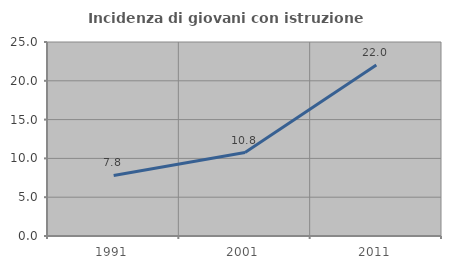
| Category | Incidenza di giovani con istruzione universitaria |
|---|---|
| 1991.0 | 7.797 |
| 2001.0 | 10.756 |
| 2011.0 | 22.026 |